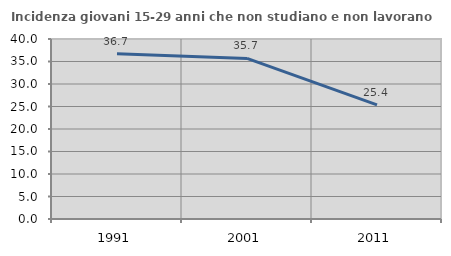
| Category | Incidenza giovani 15-29 anni che non studiano e non lavorano  |
|---|---|
| 1991.0 | 36.705 |
| 2001.0 | 35.676 |
| 2011.0 | 25.373 |